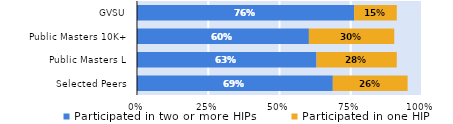
| Category | Participated in two or more HIPs | Participated in one HIP |
|---|---|---|
| Selected Peers | 0.687 | 0.262 |
| Public Masters L | 0.63 | 0.282 |
| Public Masters 10K+ | 0.603 | 0.299 |
| GVSU | 0.762 | 0.15 |